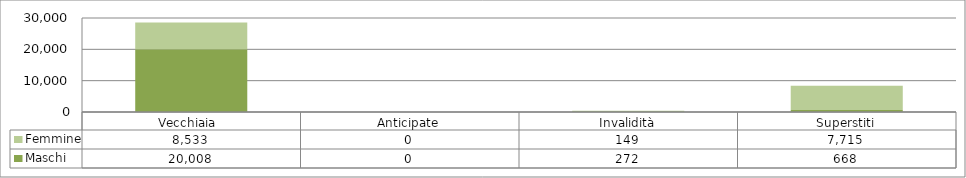
| Category | Maschi | Femmine |
|---|---|---|
| Vecchiaia  | 20008 | 8533 |
| Anticipate | 0 | 0 |
| Invalidità | 272 | 149 |
| Superstiti | 668 | 7715 |